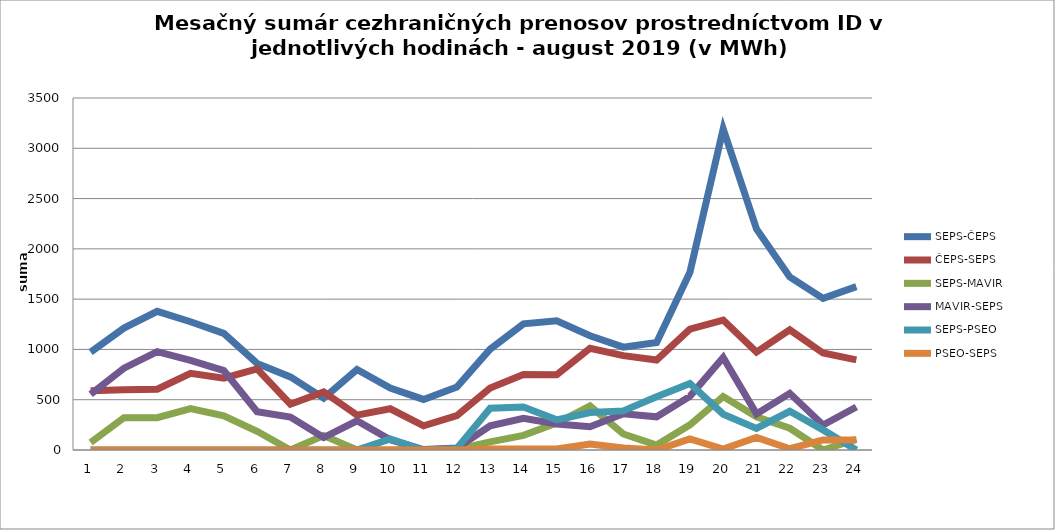
| Category | SEPS-ČEPS | ČEPS-SEPS | SEPS-MAVIR | MAVIR-SEPS | SEPS-PSEO | PSEO-SEPS |
|---|---|---|---|---|---|---|
| 1.0 | 973 | 590 | 74 | 555 | 0 | 0 |
| 2.0 | 1212 | 599 | 321 | 813 | 0 | 0 |
| 3.0 | 1379 | 605 | 321 | 978 | 0 | 0 |
| 4.0 | 1275 | 763 | 411 | 892 | 0 | 0 |
| 5.0 | 1159 | 715 | 339 | 790 | 0 | 0 |
| 6.0 | 861 | 806 | 186 | 381 | 0 | 0 |
| 7.0 | 727 | 455 | 0 | 328 | 0 | 0 |
| 8.0 | 516 | 578 | 143 | 124 | 0 | 0 |
| 9.0 | 800 | 347 | 0 | 290 | 0 | 0 |
| 10.0 | 615 | 410 | 0 | 101 | 110 | 0 |
| 11.0 | 503 | 240 | 5 | 4 | 0 | 0 |
| 12.0 | 627 | 341 | 5 | 19 | 15 | 0 |
| 13.0 | 1003 | 616 | 81 | 240 | 415 | 10 |
| 14.0 | 1254 | 750 | 146 | 316 | 427 | 10 |
| 15.0 | 1285 | 749 | 267 | 258 | 300 | 10 |
| 16.0 | 1136 | 1011 | 437 | 232 | 372 | 59 |
| 17.0 | 1023 | 938 | 159 | 360 | 389 | 20 |
| 18.0 | 1069 | 894 | 49 | 330 | 529 | 0 |
| 19.0 | 1767 | 1202 | 250 | 533 | 661 | 110 |
| 20.0 | 3193 | 1292 | 531 | 919 | 356 | 10 |
| 21.0 | 2198 | 973 | 330 | 359 | 215 | 125 |
| 22.0 | 1721 | 1195 | 216 | 564 | 385 | 13 |
| 23.0 | 1508 | 964 | 0 | 248 | 200 | 100 |
| 24.0 | 1624 | 896 | 107 | 428 | 0 | 100 |